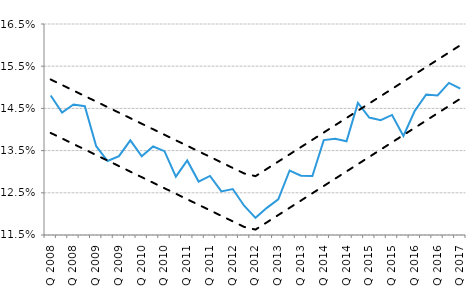
| Category | EDS | Dolny interval | Horny interval |
|---|---|---|---|
| 1 Q 2008 | 0.148 | 0.139 | 0.152 |
| 2 Q 2008 | 0.144 | 0.138 | 0.151 |
| 3 Q 2008 | 0.146 | 0.137 | 0.149 |
| 4 Q 2008 | 0.146 | 0.135 | 0.148 |
| 1 Q 2009 | 0.136 | 0.134 | 0.147 |
| 2 Q 2009 | 0.133 | 0.133 | 0.145 |
| 3 Q 2009 | 0.134 | 0.131 | 0.144 |
| 4 Q 2009 | 0.137 | 0.13 | 0.143 |
| 1 Q 2010 | 0.134 | 0.129 | 0.141 |
| 2 Q 2010 | 0.136 | 0.127 | 0.14 |
| 3 Q 2010 | 0.135 | 0.126 | 0.139 |
| 4 Q 2010 | 0.129 | 0.125 | 0.137 |
| 1 Q 2011 | 0.133 | 0.123 | 0.136 |
| 2 Q 2011 | 0.128 | 0.122 | 0.135 |
| 3 Q 2011 | 0.129 | 0.121 | 0.134 |
| 4 Q 2011 | 0.125 | 0.12 | 0.132 |
| 1 Q 2012 | 0.126 | 0.118 | 0.131 |
| 2 Q 2012 | 0.122 | 0.117 | 0.13 |
| 3 Q 2012 | 0.119 | 0.116 | 0.129 |
| 4 Q 2012 | 0.121 | 0.118 | 0.131 |
| 1 Q 2013 | 0.123 | 0.12 | 0.132 |
| 2 Q 2013 | 0.13 | 0.121 | 0.134 |
| 3 Q 2013 | 0.129 | 0.123 | 0.136 |
| 4 Q 2013 | 0.129 | 0.125 | 0.138 |
| 1 Q 2014 | 0.137 | 0.127 | 0.139 |
| 2 Q 2014 | 0.138 | 0.128 | 0.141 |
| 3 Q 2014 | 0.137 | 0.13 | 0.143 |
| 4 Q 2014 | 0.146 | 0.132 | 0.144 |
| 1 Q 2015 | 0.143 | 0.134 | 0.146 |
| 2 Q 2015 | 0.142 | 0.135 | 0.148 |
| 3 Q 2015 | 0.143 | 0.137 | 0.15 |
| 4 Q 2015 | 0.138 | 0.139 | 0.151 |
| 1 Q 2016 | 0.144 | 0.14 | 0.153 |
| 2 Q 2016 | 0.148 | 0.142 | 0.155 |
| 3 Q 2016 | 0.148 | 0.144 | 0.157 |
| 4 Q 2016 | 0.151 | 0.146 | 0.158 |
| 1 Q 2017 | 0.15 | 0.147 | 0.16 |